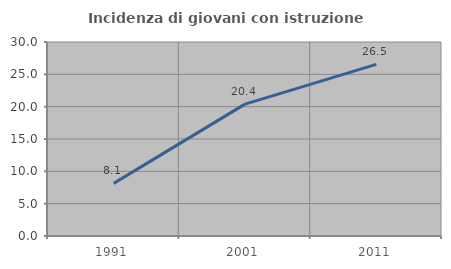
| Category | Incidenza di giovani con istruzione universitaria |
|---|---|
| 1991.0 | 8.14 |
| 2001.0 | 20.388 |
| 2011.0 | 26.531 |